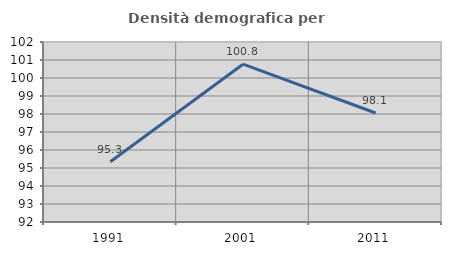
| Category | Densità demografica |
|---|---|
| 1991.0 | 95.347 |
| 2001.0 | 100.766 |
| 2011.0 | 98.057 |